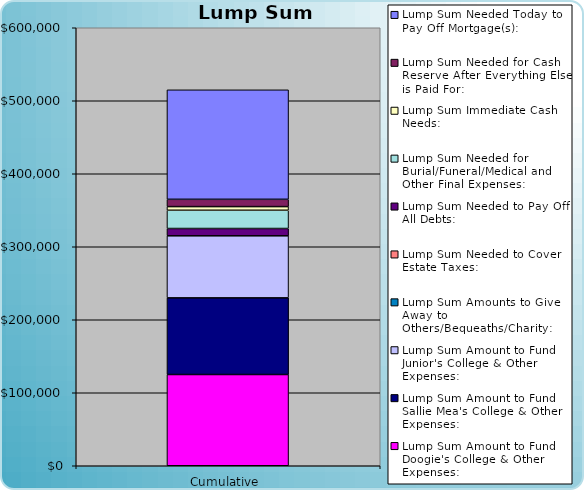
| Category |   | Lump Sum Amount to Fund Doogie's College & Other Expenses: | Lump Sum Amount to Fund Sallie Mea's College & Other Expenses: | Lump Sum Amount to Fund Junior's College & Other Expenses: | Lump Sum Amounts to Give Away to Others/Bequeaths/Charity: | Lump Sum Needed to Cover Estate Taxes: | Lump Sum Needed to Pay Off All Debts: | Lump Sum Needed for Burial/Funeral/Medical and Other Final Expenses: | Lump Sum Immediate Cash Needs: | Lump Sum Needed for Cash Reserve After Everything Else is Paid For: | Lump Sum Needed Today to Pay Off Mortgage(s): |
|---|---|---|---|---|---|---|---|---|---|---|---|
| 0 |  | 125000 | 105000 | 85000 | 0 | 0 | 10000 | 25000 | 5000 | 10000 | 150000 |